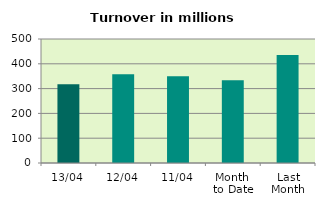
| Category | Series 0 |
|---|---|
| 13/04 | 317.415 |
| 12/04 | 358.176 |
| 11/04 | 350.149 |
| Month 
to Date | 333.94 |
| Last
Month | 435.216 |